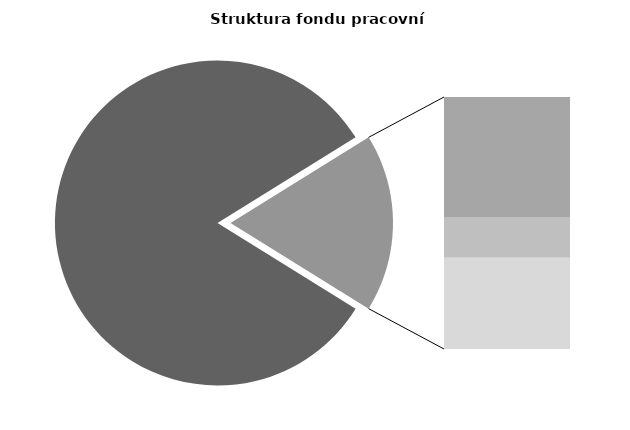
| Category | Series 0 |
|---|---|
| Průměrná měsíční odpracovaná doba bez přesčasu | 141.841 |
| Dovolená | 14.588 |
| Nemoc | 4.841 |
| Jiné | 11.007 |